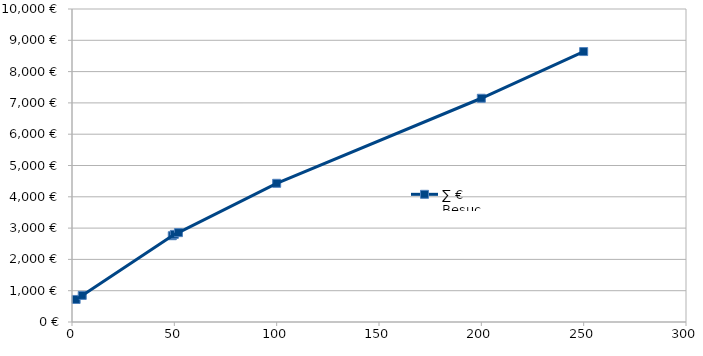
| Category | ∑ € Besuchsaudit |
|---|---|
| 2.0 | 720 |
| 5.0 | 850 |
| 49.0 | 2756.667 |
| 50.0 | 2800 |
| 52.0 | 2855.2 |
| 100.0 | 4431.129 |
| 200.0 | 7148.333 |
| 250.0 | 8640 |